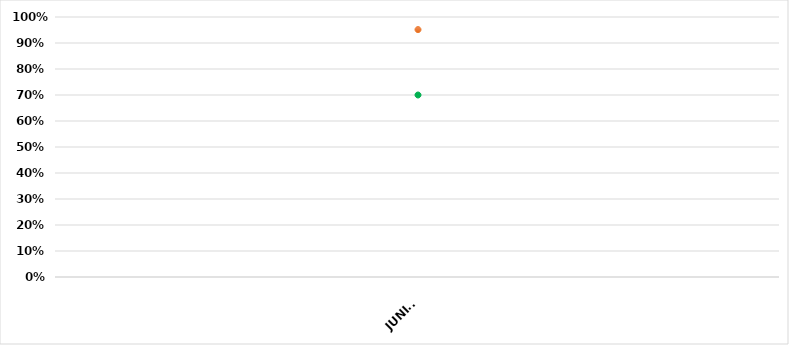
| Category | VALOR  | META PONDERADA |
|---|---|---|
| JUNIO | 0.951 | 0.7 |